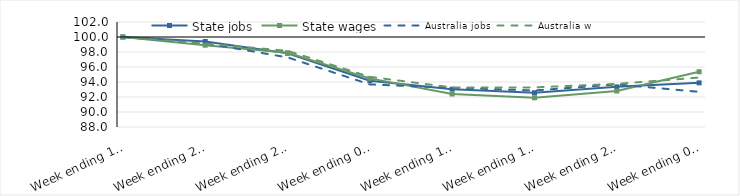
| Category | State jobs | State wages | Australia jobs | Australia wages |
|---|---|---|---|---|
| 2020-03-14 | 100 | 100 | 100 | 100 |
| 2020-03-21 | 99.398 | 98.905 | 99.165 | 99.123 |
| 2020-03-28 | 97.834 | 97.889 | 97.282 | 98.156 |
| 2020-04-04 | 94.17 | 94.48 | 93.679 | 94.686 |
| 2020-04-11 | 93.042 | 92.398 | 93.222 | 93.277 |
| 2020-04-18 | 92.566 | 91.898 | 92.871 | 93.281 |
| 2020-04-25 | 93.352 | 92.794 | 93.679 | 93.754 |
| 2020-05-02 | 93.886 | 95.369 | 92.686 | 94.591 |